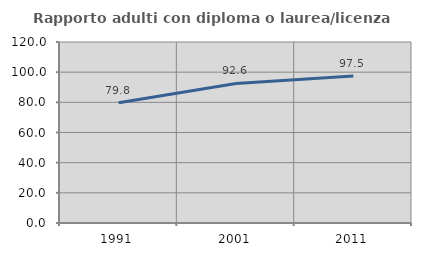
| Category | Rapporto adulti con diploma o laurea/licenza media  |
|---|---|
| 1991.0 | 79.79 |
| 2001.0 | 92.551 |
| 2011.0 | 97.451 |